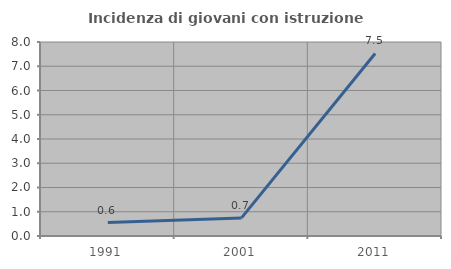
| Category | Incidenza di giovani con istruzione universitaria |
|---|---|
| 1991.0 | 0.556 |
| 2001.0 | 0.746 |
| 2011.0 | 7.527 |